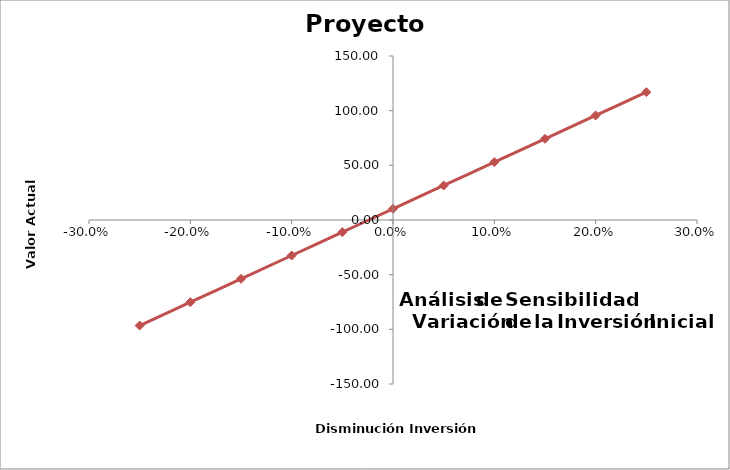
| Category | Series 0 |
|---|---|
| -0.25 | -96.526 |
| -0.2 | -75.176 |
| -0.15 | -53.826 |
| -0.1 | -32.476 |
| -0.05 | -11.126 |
| 0.0 | 10.224 |
| 0.05 | 31.574 |
| 0.1 | 52.924 |
| 0.15 | 74.274 |
| 0.2 | 95.624 |
| 0.25 | 116.974 |